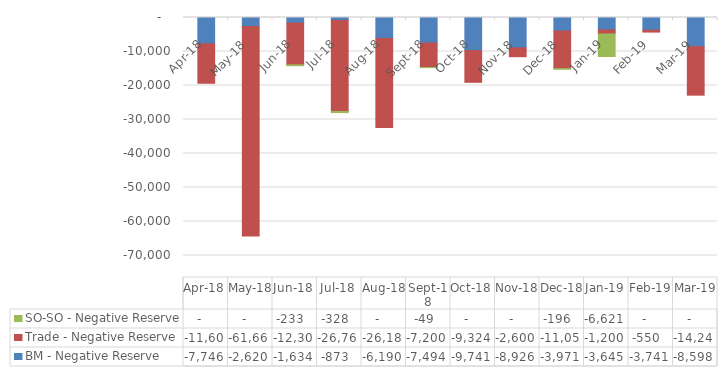
| Category | BM - Negative Reserve | Trade - Negative Reserve | SO-SO - Negative Reserve |
|---|---|---|---|
| 2018-04-30 | -7746.036 | -11600 | 0 |
| 2018-05-31 | -2620.02 | -61661 | 0 |
| 2018-06-30 | -1634.106 | -12300 | -232.683 |
| 2018-07-31 | -872.907 | -26763 | -327.558 |
| 2018-08-31 | -6190.289 | -26185 | 0 |
| 2018-09-30 | -7493.993 | -7200 | -48.51 |
| 2018-10-31 | -9740.767 | -9323.5 | 0 |
| 2018-11-30 | -8926.221 | -2600 | 0 |
| 2018-12-31 | -3970.527 | -11056 | -196.017 |
| 2019-01-31 | -3645.28 | -1200 | -6620.949 |
| 2019-02-28 | -3740.555 | -550 | 0 |
| 2019-03-31 | -8598.135 | -14244 | 0 |